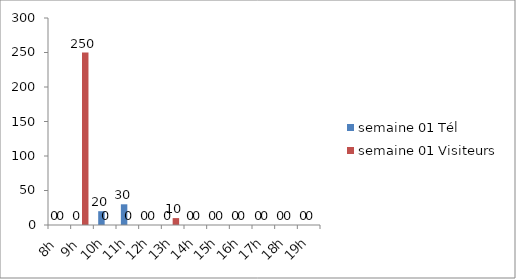
| Category | semaine 01 Tél | semaine 01 Visiteurs |
|---|---|---|
| 8h | 0 | 0 |
| 9h | 0 | 250 |
| 10h | 20 | 0 |
| 11h | 30 | 0 |
| 12h | 0 | 0 |
| 13h | 0 | 10 |
| 14h | 0 | 0 |
| 15h | 0 | 0 |
| 16h | 0 | 0 |
| 17h | 0 | 0 |
| 18h | 0 | 0 |
| 19h | 0 | 0 |